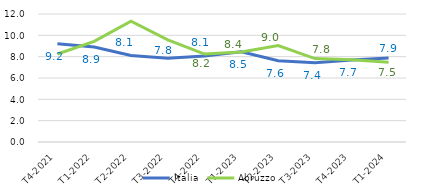
| Category | Italia | Abruzzo |
|---|---|---|
|   T4-2021 | 9.222 | 8.254 |
|   T1-2022 | 8.898 | 9.43 |
|   T2-2022 | 8.105 | 11.322 |
|   T3-2022 | 7.843 | 9.583 |
|   T4-2022 | 8.065 | 8.244 |
|   T1-2023 | 8.454 | 8.433 |
|    T2-2023 | 7.612 | 9.045 |
|    T3-2023 | 7.432 | 7.817 |
|    T4-2023 | 7.696 | 7.719 |
|    T1-2024 | 7.877 | 7.479 |